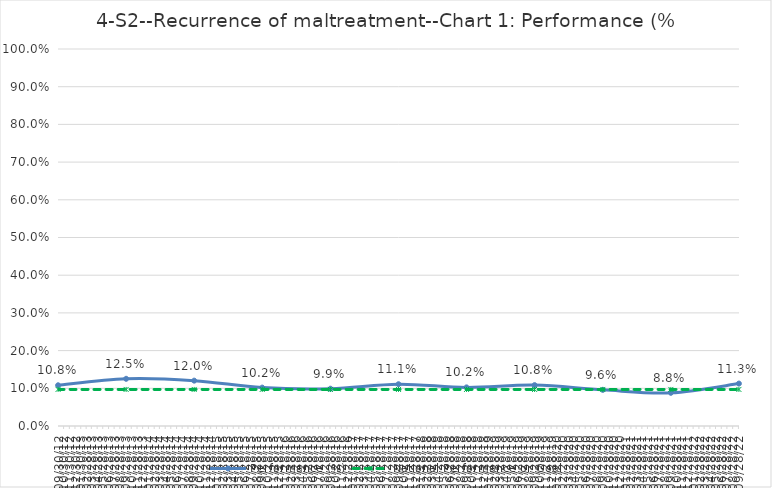
| Category | Performance (%) | National Performance or Goal |
|---|---|---|
| 2012-09-30 | 0.108 | 0.097 |
| 2013-09-30 | 0.125 | 0.097 |
| 2014-09-30 | 0.12 | 0.097 |
| 2015-09-30 | 0.102 | 0.097 |
| 2016-09-30 | 0.099 | 0.097 |
| 2017-09-30 | 0.111 | 0.097 |
| 2018-09-30 | 0.102 | 0.097 |
| 2019-09-30 | 0.108 | 0.097 |
| 2020-09-30 | 0.096 | 0.097 |
| 2021-09-30 | 0.088 | 0.097 |
| 2022-09-30 | 0.113 | 0.097 |